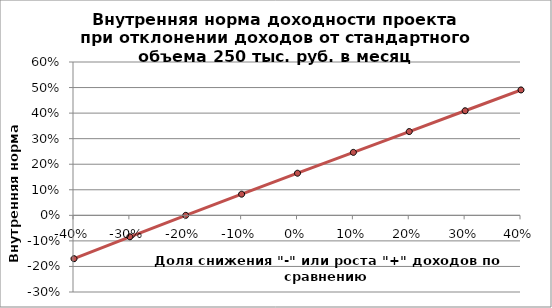
| Category | Series 1 |
|---|---|
| -0.4 | -0.17 |
| -0.30000000000000004 | -0.084 |
| -0.20000000000000004 | 0 |
| -0.10000000000000003 | 0.083 |
| 0.0 | 0.165 |
| 0.1 | 0.246 |
| 0.2 | 0.328 |
| 0.30000000000000004 | 0.409 |
| 0.4 | 0.491 |